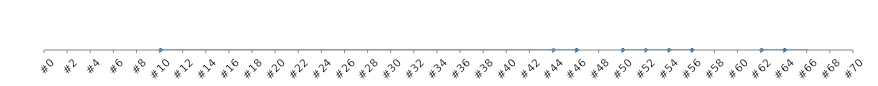
| Category | Series 0 |
|---|---|
| #0 | 0 |
| #2 | 0 |
| #4 | 0 |
| #6 | 0 |
| #8 | 0 |
| #10 | 0 |
| #12 | 0 |
| #14 | 0 |
| #16 | 0 |
| #18 | 0 |
| #20 | 0 |
| #22 | 0 |
| #24 | 0 |
| #26 | 0 |
| #28 | 0 |
| #30 | 0 |
| #32 | 0 |
| #34 | 0 |
| #36 | 0 |
| #38 | 0 |
| #40 | 0 |
| #42 | 0 |
| #44 | 0 |
| #46 | 0 |
| #48 | 0 |
| #50 | 0 |
| #52 | 0 |
| #54 | 0 |
| #56 | 0 |
| #58 | 0 |
| #60 | 0 |
| #62 | 0 |
| #64 | 0 |
| #66 | 0 |
| #68 | 0 |
| #70 | 0 |